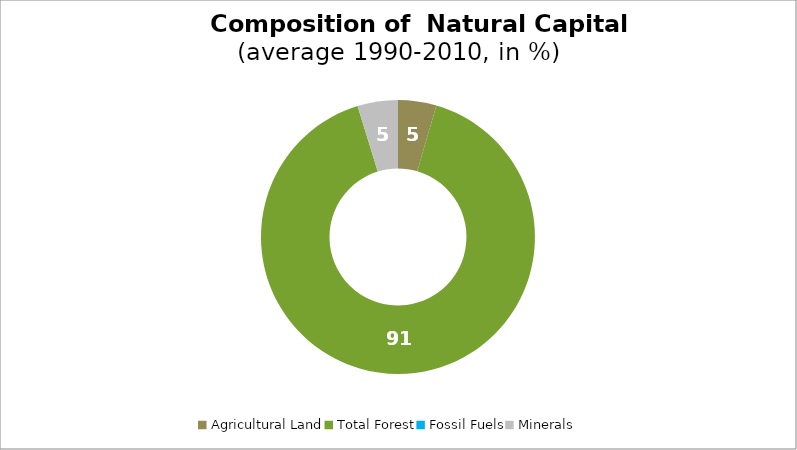
| Category | Series 0 |
|---|---|
| Agricultural Land | 4.52 |
| Total Forest | 90.709 |
| Fossil Fuels | 0 |
| Minerals | 4.772 |